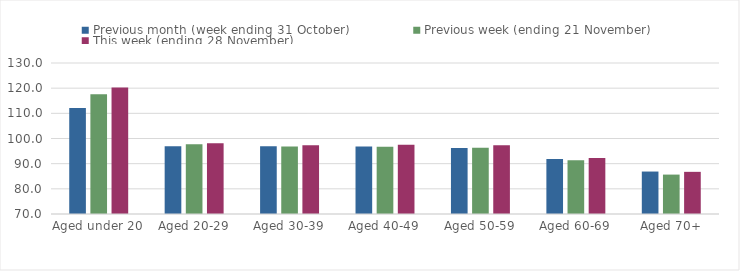
| Category | Previous month (week ending 31 October) | Previous week (ending 21 November) | This week (ending 28 November) |
|---|---|---|---|
| Aged under 20 | 112.09 | 117.63 | 120.23 |
| Aged 20-29 | 96.96 | 97.69 | 98.14 |
| Aged 30-39 | 96.95 | 96.84 | 97.32 |
| Aged 40-49 | 96.78 | 96.73 | 97.56 |
| Aged 50-59 | 96.2 | 96.37 | 97.35 |
| Aged 60-69 | 91.86 | 91.31 | 92.28 |
| Aged 70+ | 86.87 | 85.66 | 86.75 |